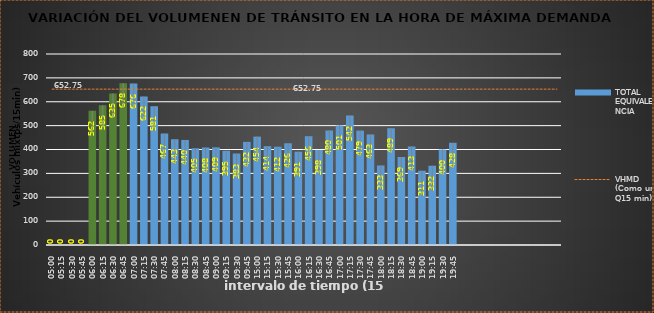
| Category | TOTAL EQUIVALENCIA   |
|---|---|
| 500.0 | 0 |
| 515.0 | 0 |
| 530.0 | 0 |
| 545.0 | 0 |
| 600.0 | 562 |
| 615.0 | 585 |
| 630.0 | 635 |
| 645.0 | 678 |
| 700.0 | 676 |
| 715.0 | 622 |
| 730.0 | 581 |
| 745.0 | 467 |
| 800.0 | 443 |
| 815.0 | 440 |
| 830.0 | 405 |
| 845.0 | 408 |
| 900.0 | 409 |
| 915.0 | 395 |
| 930.0 | 383 |
| 945.0 | 432 |
| 1500.0 | 454 |
| 1515.0 | 414 |
| 1530.0 | 412 |
| 1545.0 | 426 |
| 1600.0 | 391 |
| 1615.0 | 456 |
| 1630.0 | 398 |
| 1645.0 | 480 |
| 1700.0 | 501 |
| 1715.0 | 542 |
| 1730.0 | 479 |
| 1745.0 | 463 |
| 1800.0 | 333 |
| 1815.0 | 489 |
| 1830.0 | 369 |
| 1845.0 | 413 |
| 1900.0 | 311 |
| 1915.0 | 332 |
| 1930.0 | 400 |
| 1945.0 | 428 |